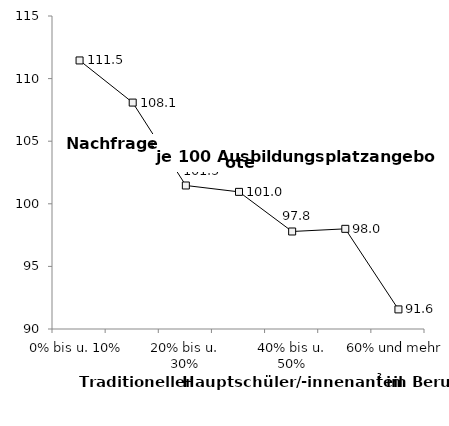
| Category | Nachfrage je 100 Ausbildungsplatzangebote |
|---|---|
| 0% bis u. 10% | 111.45 |
| 10% bis u. 20% | 108.084 |
| 20% bis u. 30% | 101.462 |
| 30% bis u. 40% | 100.953 |
| 40% bis u. 50% | 97.788 |
| 50% bis u. 60% | 98 |
| 60% und mehr | 91.565 |